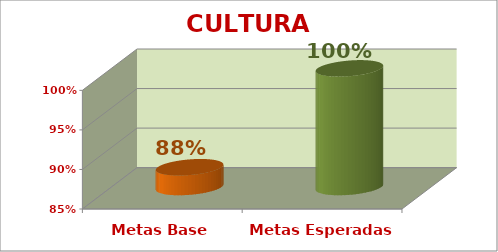
| Category | CULTURA INSTITUCIONAL |
|---|---|
| Metas Base | 0.875 |
| Metas Esperadas | 1 |